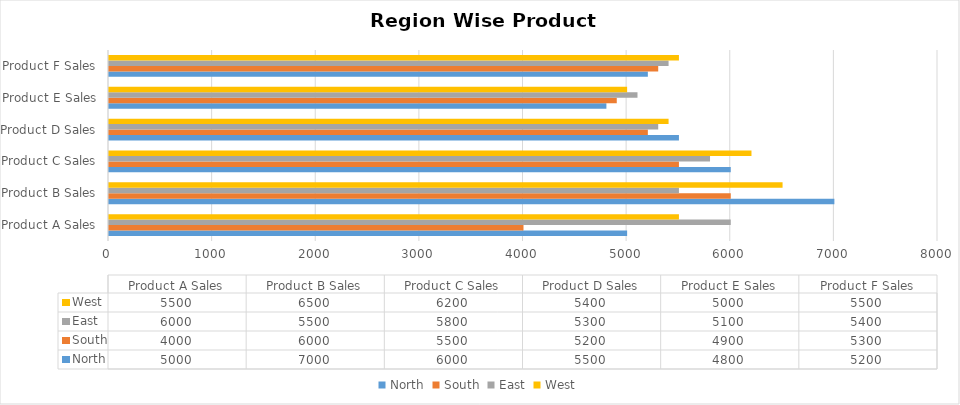
| Category | North | South | East | West |
|---|---|---|---|---|
| Product A Sales | 5000 | 4000 | 6000 | 5500 |
| Product B Sales | 7000 | 6000 | 5500 | 6500 |
| Product C Sales | 6000 | 5500 | 5800 | 6200 |
| Product D Sales | 5500 | 5200 | 5300 | 5400 |
| Product E Sales | 4800 | 4900 | 5100 | 5000 |
| Product F Sales | 5200 | 5300 | 5400 | 5500 |